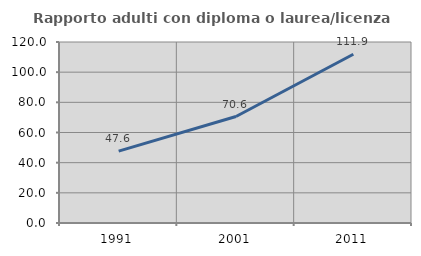
| Category | Rapporto adulti con diploma o laurea/licenza media  |
|---|---|
| 1991.0 | 47.63 |
| 2001.0 | 70.599 |
| 2011.0 | 111.889 |